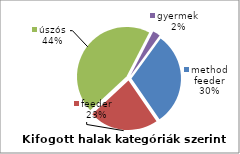
| Category | Series 0 |
|---|---|
| method feeder | 1037715 |
| feeder | 772805 |
| úszós | 1517080 |
| gyermek | 82600 |